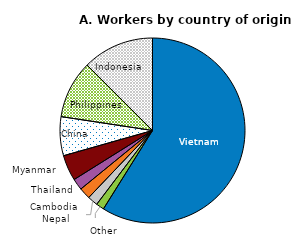
| Category | Series 0 |
|---|---|
| Vietnam | 58.9 |
| Other | 1.4 |
| Nepal | 1.8 |
| Cambodia | 2 |
| Thailand | 2 |
| Myanmar | 4.5 |
| China | 6.8 |
| Philippines | 10.1 |
| Indonesia | 12.5 |